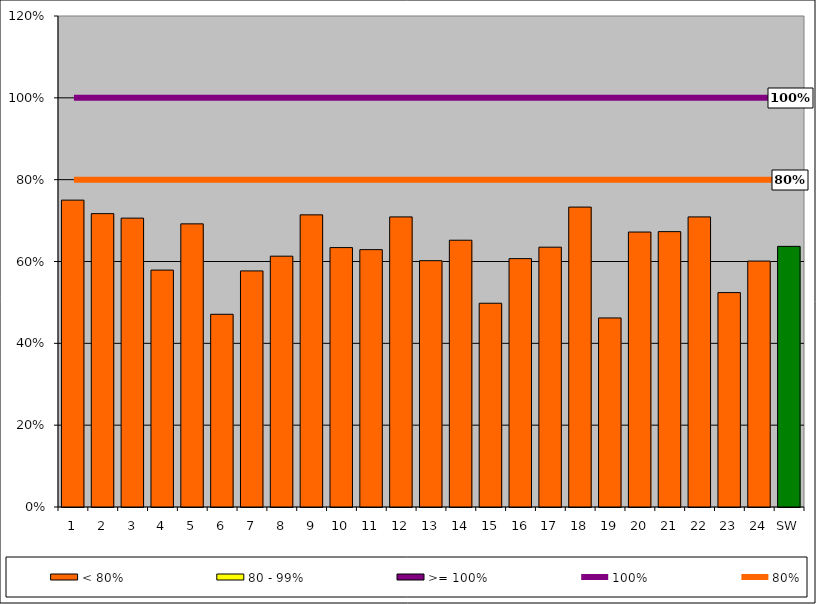
| Category | < 80% | 80 - 99% | >= 100% |
|---|---|---|---|
| 1 | 0.75 | 0 | 0 |
| 2 | 0.717 | 0 | 0 |
| 3 | 0.706 | 0 | 0 |
| 4 | 0.579 | 0 | 0 |
| 5 | 0.692 | 0 | 0 |
| 6 | 0.471 | 0 | 0 |
| 7 | 0.577 | 0 | 0 |
| 8 | 0.613 | 0 | 0 |
| 9 | 0.714 | 0 | 0 |
| 10 | 0.634 | 0 | 0 |
| 11 | 0.629 | 0 | 0 |
| 12 | 0.709 | 0 | 0 |
| 13 | 0.602 | 0 | 0 |
| 14 | 0.652 | 0 | 0 |
| 15 | 0.498 | 0 | 0 |
| 16 | 0.607 | 0 | 0 |
| 17 | 0.635 | 0 | 0 |
| 18 | 0.733 | 0 | 0 |
| 19 | 0.462 | 0 | 0 |
| 20 | 0.672 | 0 | 0 |
| 21 | 0.673 | 0 | 0 |
| 22 | 0.709 | 0 | 0 |
| 23 | 0.524 | 0 | 0 |
| 24 | 0.601 | 0 | 0 |
| SW | 0.637 | 0 | 0 |